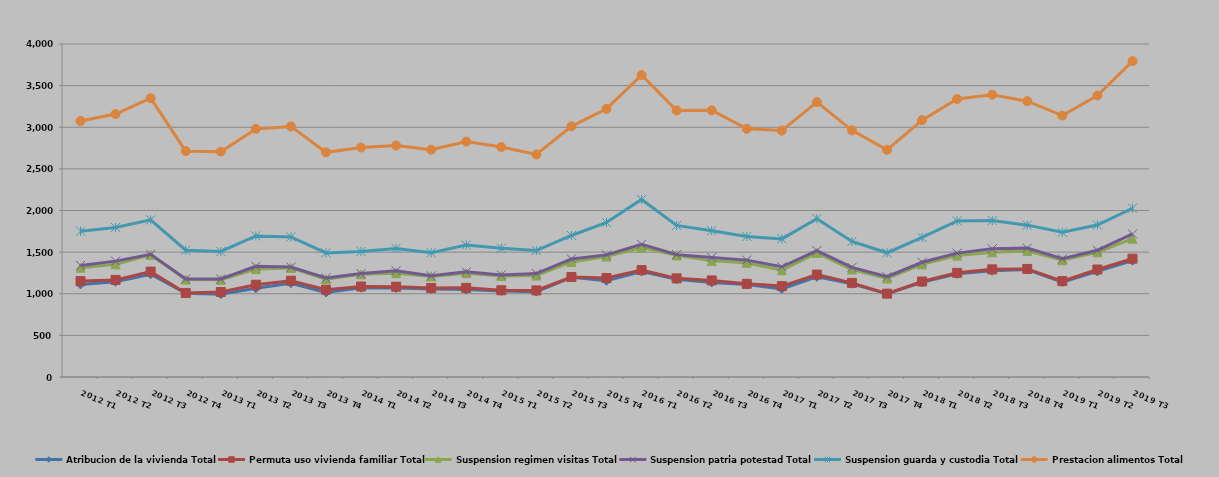
| Category | Atribucion de la vivienda Total | Permuta uso vivienda familiar Total | Suspension regimen visitas Total | Suspension patria potestad Total | Suspension guarda y custodia Total | Prestacion alimentos Total |
|---|---|---|---|---|---|---|
| 2012 T1 | 1112 | 40 | 161 | 27 | 412 | 1323 |
| 2012 T2 | 1145 | 21 | 187 | 39 | 404 | 1362 |
| 2012 T3 | 1234 | 32 | 201 | 6 | 415 | 1461 |
| 2012 T4 | 1006 | 4 | 161 | 7 | 345 | 1190 |
| 2013 T1 | 994 | 27 | 146 | 11 | 330 | 1199 |
| 2013 T2 | 1065 | 43 | 189 | 32 | 366 | 1285 |
| 2013 T3 | 1127 | 30 | 153 | 10 | 363 | 1327 |
| 2013 T4 | 1015 | 34 | 125 | 16 | 301 | 1208 |
| 2014 T1 | 1073 | 14 | 146 | 9 | 266 | 1249 |
| 2014 T2 | 1068 | 17 | 162 | 30 | 267 | 1237 |
| 2014 T3 | 1056 | 13 | 139 | 7 | 278 | 1237 |
| 2014 T4 | 1050 | 21 | 176 | 16 | 322 | 1243 |
| 2015 T1 | 1033 | 9 | 171 | 13 | 321 | 1216 |
| 2015 T2 | 1025 | 15 | 179 | 23 | 277 | 1154 |
| 2015 T3 | 1198 | 3 | 181 | 36 | 282 | 1311 |
| 2015 T4 | 1156 | 33 | 257 | 21 | 389 | 1365 |
| 2016 T1 | 1266 | 18 | 270 | 40 | 539 | 1494 |
| 2016 T2 | 1175 | 10 | 276 | 9 | 351 | 1381 |
| 2016 T3 | 1136 | 24 | 235 | 41 | 322 | 1446 |
| 2016 T4 | 1112 | 7 | 254 | 31 | 284 | 1293 |
| 2017 T1 | 1058 | 34 | 190 | 42 | 335 | 1301 |
| 2017 T2 | 1204 | 26 | 261 | 27 | 384 | 1400 |
| 2017 T3 | 1120 | 11 | 160 | 25 | 312 | 1335 |
| 2017 T4 | 1000 | 1 | 182 | 22 | 287 | 1237 |
| 2018 T1 | 1137 | 10 | 206 | 25 | 298 | 1409 |
| 2018 T2 | 1239 | 12 | 207 | 30 | 387 | 1464 |
| 2018 T3 | 1277 | 16 | 205 | 42 | 340 | 1511 |
| 2018 T4 | 1290 | 8 | 217 | 33 | 276 | 1489 |
| 2019 T1 | 1139 | 13 | 250 | 18 | 318 | 1402 |
| 2019 T2 | 1268 | 23 | 207 | 24 | 304 | 1555 |
| 2019 T3 | 1398 | 23 | 240 | 57 | 309 | 1767 |